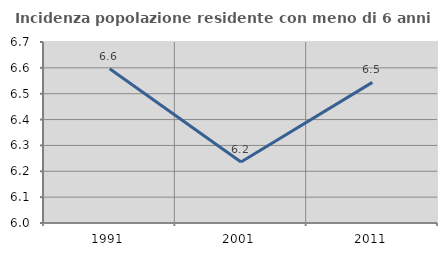
| Category | Incidenza popolazione residente con meno di 6 anni |
|---|---|
| 1991.0 | 6.597 |
| 2001.0 | 6.236 |
| 2011.0 | 6.544 |